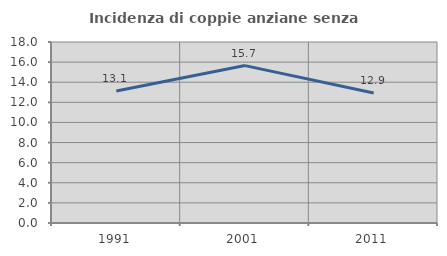
| Category | Incidenza di coppie anziane senza figli  |
|---|---|
| 1991.0 | 13.13 |
| 2001.0 | 15.653 |
| 2011.0 | 12.922 |